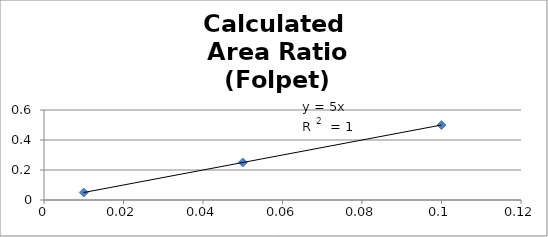
| Category | Calculated
 Area Ratio
 (Folpet) |
|---|---|
| 0.01 | 0.05 |
| 0.05 | 0.25 |
| 0.1 | 0.5 |